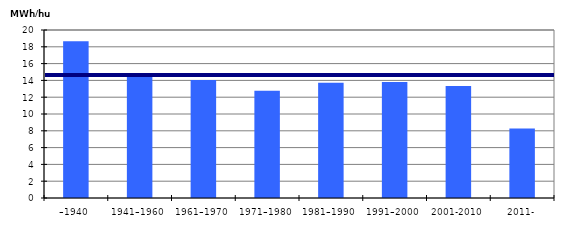
| Category | MWH/hus |
|---|---|
| –1940 | 18.659 |
| 1941–1960 | 14.536 |
| 1961–1970 | 14.049 |
| 1971–1980 | 12.772 |
| 1981–1990 | 13.718 |
| 1991–2000 | 13.812 |
| 2001-2010 | 13.34 |
| 2011- | 8.275 |